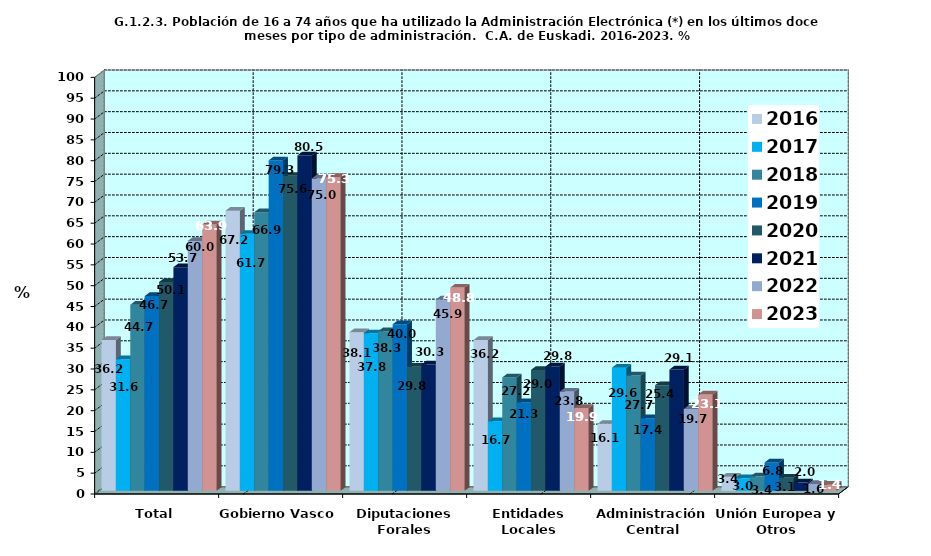
| Category | 2016 | 2017 | 2018 | 2019 | 2020 | 2021 | 2022 | 2023 |
|---|---|---|---|---|---|---|---|---|
| Total | 36.231 | 31.608 | 44.663 | 46.748 | 50.139 | 53.699 | 59.995 | 63.927 |
| Gobierno Vasco | 67.249 | 61.687 | 66.88 | 79.325 | 75.608 | 80.505 | 74.974 | 75.335 |
| Diputaciones Forales | 38.099 | 37.801 | 38.329 | 39.981 | 29.789 | 30.332 | 45.925 | 48.786 |
| Entidades Locales | 36.213 | 16.693 | 27.228 | 21.273 | 29.035 | 29.848 | 23.825 | 19.897 |
| Administración Central | 16.081 | 29.562 | 27.688 | 17.433 | 25.367 | 29.122 | 19.657 | 23.131 |
| Unión Europea y Otros | 3.41 | 3.015 | 3.426 | 6.83 | 3.137 | 1.994 | 1.642 | 1.447 |